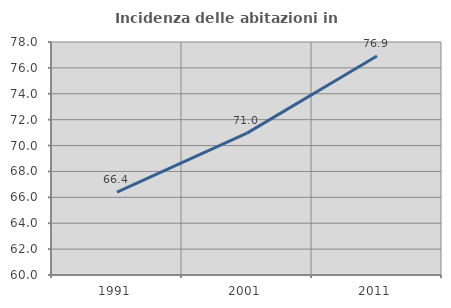
| Category | Incidenza delle abitazioni in proprietà  |
|---|---|
| 1991.0 | 66.397 |
| 2001.0 | 70.962 |
| 2011.0 | 76.923 |